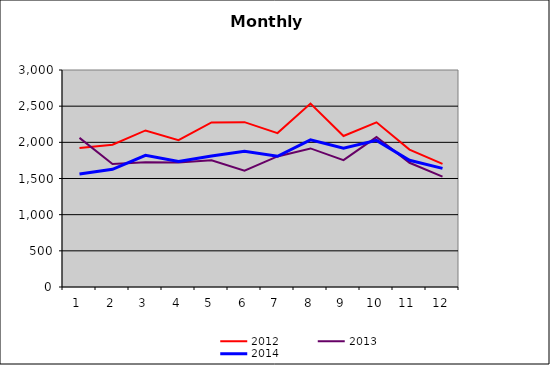
| Category | 2012 | 2013 | 2014 |
|---|---|---|---|
| 0 | 1920.425 | 2061.224 | 1562.786 |
| 1 | 1966.605 | 1701.465 | 1626.919 |
| 2 | 2164.275 | 1724.869 | 1819.397 |
| 3 | 2030.676 | 1722.168 | 1736.987 |
| 4 | 2275.443 | 1750.754 | 1811.627 |
| 5 | 2278.778 | 1609.116 | 1877.234 |
| 6 | 2127.498 | 1804.984 | 1806.747 |
| 7 | 2535.631 | 1915.765 | 2034.885 |
| 8 | 2087.515 | 1753.392 | 1917.793 |
| 9 | 2276.632 | 2072.87 | 2027.253 |
| 10 | 1899.519 | 1717.303 | 1752.347 |
| 11 | 1701.454 | 1525.855 | 1640.395 |